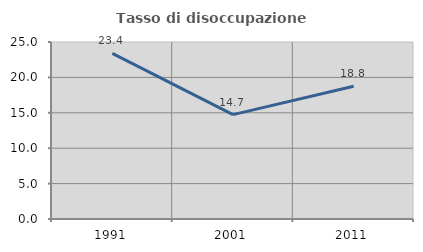
| Category | Tasso di disoccupazione giovanile  |
|---|---|
| 1991.0 | 23.404 |
| 2001.0 | 14.737 |
| 2011.0 | 18.75 |